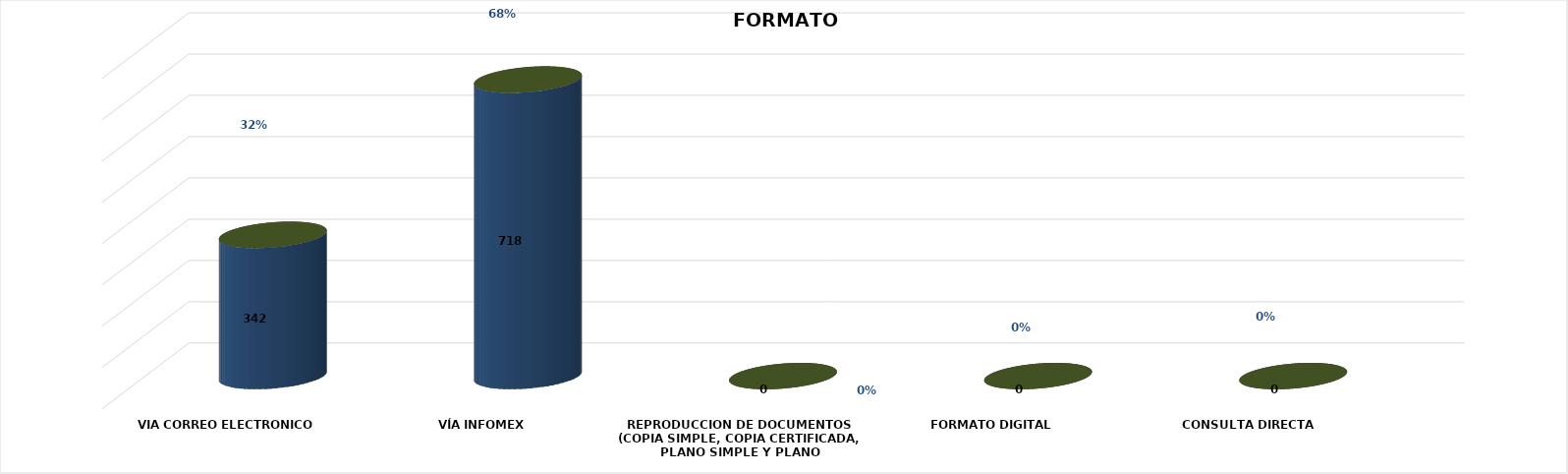
| Category | Series 0 | Series 1 | Series 2 | Series 3 | Series 4 |
|---|---|---|---|---|---|
| VIA CORREO ELECTRONICO |  |  |  | 342 | 0.323 |
| VÍA INFOMEX |  |  |  | 718 | 0.677 |
| REPRODUCCION DE DOCUMENTOS (COPIA SIMPLE, COPIA CERTIFICADA, PLANO SIMPLE Y PLANO CERTIFICADO) |  |  |  | 0 | 0 |
| FORMATO DIGITAL |  |  |  | 0 | 0 |
| CONSULTA DIRECTA |  |  |  | 0 | 0 |